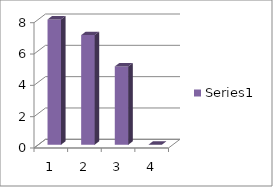
| Category | Series 0 |
|---|---|
| 0 | 8 |
| 1 | 7 |
| 2 | 5 |
| 3 | 0 |